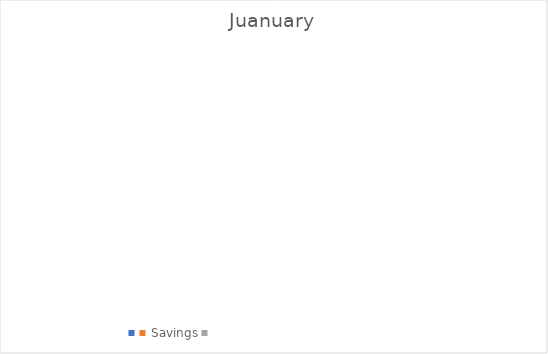
| Category | Juanuary |
|---|---|
| Savings | 0 |
| Fixed Expenses | 0 |
| Other Expensese | 0 |